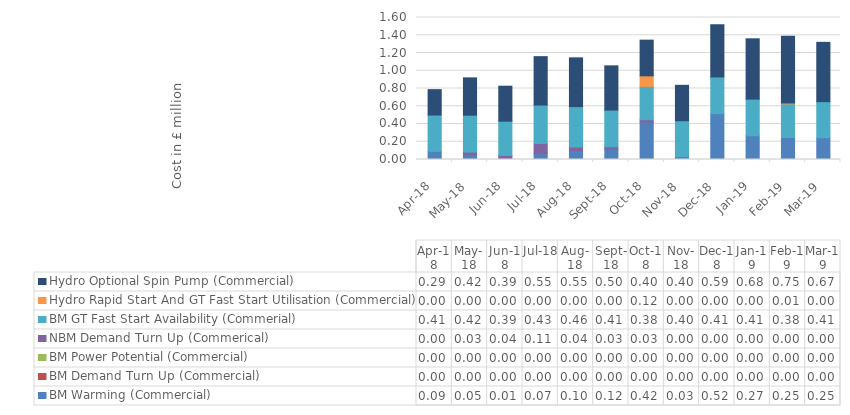
| Category | BM Warming (Commercial) | BM Demand Turn Up (Commercial) | BM Power Potential (Commercial) | NBM Demand Turn Up (Commerical) | BM GT Fast Start Availability (Commerial) | Hydro Rapid Start And GT Fast Start Utilisation (Commercial) | Hydro Optional Spin Pump (Commercial) |
|---|---|---|---|---|---|---|---|
| 2018-04-01 | 0.092 | 0 | 0 | 0 | 0.409 | 0 | 0.286 |
| 2018-05-01 | 0.052 | 0 | 0 | 0.032 | 0.416 | 0 | 0.421 |
| 2018-06-01 | 0.007 | 0 | 0 | 0.039 | 0.386 | 0 | 0.394 |
| 2018-07-01 | 0.066 | 0 | 0 | 0.115 | 0.433 | 0 | 0.545 |
| 2018-08-01 | 0.102 | 0 | 0 | 0.039 | 0.456 | 0 | 0.549 |
| 2018-09-01 | 0.115 | 0 | 0 | 0.028 | 0.413 | 0 | 0.498 |
| 2018-10-01 | 0.422 | 0 | 0 | 0.026 | 0.376 | 0.119 | 0.402 |
| 2018-11-01 | 0.034 | 0 | 0 | 0 | 0.403 | 0 | 0.399 |
| 2018-12-01 | 0.516 | 0 | 0 | 0 | 0.414 | 0 | 0.588 |
| 2019-01-01 | 0.267 | 0 | 0 | 0 | 0.413 | 0 | 0.679 |
| 2019-02-01 | 0.248 | 0 | 0 | 0 | 0.379 | 0.01 | 0.752 |
| 2019-03-01 | 0.245 | 0 | 0 | 0 | 0.407 | 0 | 0.668 |